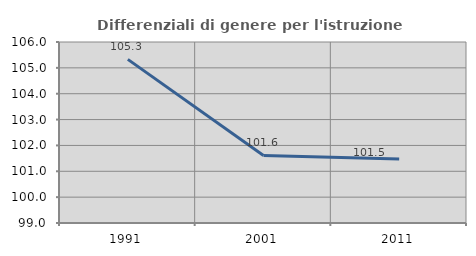
| Category | Differenziali di genere per l'istruzione superiore |
|---|---|
| 1991.0 | 105.328 |
| 2001.0 | 101.613 |
| 2011.0 | 101.474 |